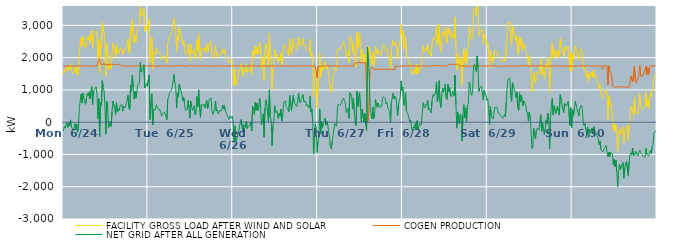
| Category | FACILITY GROSS LOAD AFTER WIND AND SOLAR | COGEN PRODUCTION | NET GRID AFTER ALL GENERATION |
|---|---|---|---|
|  Mon  6/24 | 1475 | 1747 | -272 |
|  Mon  6/24 | 1629 | 1749 | -120 |
|  Mon  6/24 | 1550 | 1734 | -184 |
|  Mon  6/24 | 1669 | 1739 | -70 |
|  Mon  6/24 | 1733 | 1733 | 0 |
|  Mon  6/24 | 1592 | 1755 | -163 |
|  Mon  6/24 | 1703 | 1735 | -32 |
|  Mon  6/24 | 1635 | 1749 | -114 |
|  Mon  6/24 | 1818 | 1746 | 72 |
|  Mon  6/24 | 1602 | 1747 | -145 |
|  Mon  6/24 | 1612 | 1739 | -127 |
|  Mon  6/24 | 1506 | 1746 | -240 |
|  Mon  6/24 | 1543 | 1742 | -199 |
|  Mon  6/24 | 1698 | 1747 | -49 |
|  Mon  6/24 | 1531 | 1743 | -212 |
|  Mon  6/24 | 1699 | 1755 | -56 |
|  Mon  6/24 | 1431 | 1742 | -311 |
|  Mon  6/24 | 1638 | 1750 | -112 |
|  Mon  6/24 | 2173 | 1754 | 419 |
|  Mon  6/24 | 2420 | 1741 | 679 |
|  Mon  6/24 | 2614 | 1742 | 872 |
|  Mon  6/24 | 2346 | 1752 | 594 |
|  Mon  6/24 | 2647 | 1748 | 899 |
|  Mon  6/24 | 2487 | 1754 | 733 |
|  Mon  6/24 | 2389 | 1743 | 646 |
|  Mon  6/24 | 2296 | 1744 | 552 |
|  Mon  6/24 | 2471 | 1741 | 730 |
|  Mon  6/24 | 2628 | 1738 | 890 |
|  Mon  6/24 | 2549 | 1742 | 807 |
|  Mon  6/24 | 2677 | 1743 | 934 |
|  Mon  6/24 | 2452 | 1730 | 722 |
|  Mon  6/24 | 2474 | 1739 | 735 |
|  Mon  6/24 | 2854 | 1747 | 1107 |
|  Mon  6/24 | 2291 | 1742 | 549 |
|  Mon  6/24 | 2698 | 1741 | 957 |
|  Mon  6/24 | 2743 | 1745 | 998 |
|  Mon  6/24 | 2795 | 1743 | 1052 |
|  Mon  6/24 | 2835 | 1746 | 1089 |
|  Mon  6/24 | 2575 | 1742 | 833 |
|  Mon  6/24 | 1968 | 1859 | 109 |
|  Mon  6/24 | 2559 | 1836 | 723 |
|  Mon  6/24 | 1522 | 1966 | -444 |
|  Mon  6/24 | 2411 | 1791 | 620 |
|  Mon  6/24 | 2300 | 1780 | 520 |
|  Mon  6/24 | 3084 | 1794 | 1290 |
|  Mon  6/24 | 2879 | 1801 | 1078 |
|  Mon  6/24 | 2775 | 1803 | 972 |
|  Mon  6/24 | 2272 | 1793 | 479 |
|  Mon  6/24 | 1422 | 1792 | -370 |
|  Mon  6/24 | 2439 | 1795 | 644 |
|  Mon  6/24 | 2243 | 1787 | 456 |
|  Mon  6/24 | 1620 | 1794 | -174 |
|  Mon  6/24 | 1679 | 1790 | -111 |
|  Mon  6/24 | 1817 | 1785 | 32 |
|  Mon  6/24 | 1671 | 1796 | -125 |
|  Mon  6/24 | 2133 | 1800 | 333 |
|  Mon  6/24 | 2448 | 1796 | 652 |
|  Mon  6/24 | 2459 | 1792 | 667 |
|  Mon  6/24 | 2208 | 1783 | 425 |
|  Mon  6/24 | 2035 | 1794 | 241 |
|  Mon  6/24 | 2397 | 1793 | 604 |
|  Mon  6/24 | 2124 | 1796 | 328 |
|  Mon  6/24 | 2199 | 1794 | 405 |
|  Mon  6/24 | 2154 | 1796 | 358 |
|  Mon  6/24 | 2295 | 1790 | 505 |
|  Mon  6/24 | 2288 | 1770 | 518 |
|  Mon  6/24 | 2295 | 1739 | 556 |
|  Mon  6/24 | 2084 | 1741 | 343 |
|  Mon  6/24 | 2233 | 1738 | 495 |
|  Mon  6/24 | 2229 | 1747 | 482 |
|  Mon  6/24 | 2198 | 1742 | 456 |
|  Mon  6/24 | 2314 | 1736 | 578 |
|  Mon  6/24 | 2403 | 1728 | 675 |
|  Mon  6/24 | 2578 | 1741 | 837 |
|  Mon  6/24 | 2184 | 1740 | 444 |
|  Mon  6/24 | 2130 | 1745 | 385 |
|  Mon  6/24 | 2879 | 1734 | 1145 |
|  Mon  6/24 | 2688 | 1733 | 955 |
|  Mon  6/24 | 3191 | 1734 | 1457 |
|  Mon  6/24 | 2820 | 1736 | 1084 |
|  Mon  6/24 | 2456 | 1743 | 713 |
|  Mon  6/24 | 2694 | 1744 | 950 |
|  Mon  6/24 | 2485 | 1740 | 745 |
|  Mon  6/24 | 2674 | 1738 | 936 |
|  Mon  6/24 | 2897 | 1750 | 1147 |
|  Mon  6/24 | 2916 | 1741 | 1175 |
|  Mon  6/24 | 2957 | 1741 | 1216 |
|  Mon  6/24 | 3605 | 1754 | 1851 |
|  Mon  6/24 | 3290 | 1742 | 1548 |
|  Mon  6/24 | 3269 | 1740 | 1529 |
|  Mon  6/24 | 3362 | 1736 | 1626 |
|  Mon  6/24 | 3522 | 1743 | 1779 |
|  Mon  6/24 | 2804 | 1737 | 1067 |
|  Mon  6/24 | 2867 | 1737 | 1130 |
|  Mon  6/24 | 2952 | 1750 | 1202 |
|  Mon  6/24 | 2855 | 1741 | 1114 |
|  Tue  6/25 | 3059 | 1741 | 1318 |
|  Tue  6/25 | 3204 | 1741 | 1463 |
|  Tue  6/25 | 1836 | 1750 | 86 |
|  Tue  6/25 | 2358 | 1739 | 619 |
|  Tue  6/25 | 2622 | 1743 | 879 |
|  Tue  6/25 | 1652 | 1741 | -89 |
|  Tue  6/25 | 2157 | 1757 | 400 |
|  Tue  6/25 | 2148 | 1736 | 412 |
|  Tue  6/25 | 2110 | 1722 | 388 |
|  Tue  6/25 | 2292 | 1751 | 541 |
|  Tue  6/25 | 2300 | 1743 | 557 |
|  Tue  6/25 | 2149 | 1741 | 408 |
|  Tue  6/25 | 2136 | 1735 | 401 |
|  Tue  6/25 | 2135 | 1750 | 385 |
|  Tue  6/25 | 2042 | 1741 | 301 |
|  Tue  6/25 | 1928 | 1737 | 191 |
|  Tue  6/25 | 1994 | 1736 | 258 |
|  Tue  6/25 | 1971 | 1720 | 251 |
|  Tue  6/25 | 2053 | 1741 | 312 |
|  Tue  6/25 | 2006 | 1738 | 268 |
|  Tue  6/25 | 1991 | 1747 | 244 |
|  Tue  6/25 | 1832 | 1756 | 76 |
|  Tue  6/25 | 2462 | 1747 | 715 |
|  Tue  6/25 | 2507 | 1735 | 772 |
|  Tue  6/25 | 2661 | 1734 | 927 |
|  Tue  6/25 | 2638 | 1735 | 903 |
|  Tue  6/25 | 2721 | 1739 | 982 |
|  Tue  6/25 | 2835 | 1743 | 1092 |
|  Tue  6/25 | 3011 | 1727 | 1284 |
|  Tue  6/25 | 3214 | 1739 | 1475 |
|  Tue  6/25 | 2970 | 1743 | 1227 |
|  Tue  6/25 | 2864 | 1747 | 1117 |
|  Tue  6/25 | 2190 | 1756 | 434 |
|  Tue  6/25 | 2656 | 1745 | 911 |
|  Tue  6/25 | 2519 | 1742 | 777 |
|  Tue  6/25 | 2926 | 1751 | 1175 |
|  Tue  6/25 | 2828 | 1746 | 1082 |
|  Tue  6/25 | 2826 | 1721 | 1105 |
|  Tue  6/25 | 2608 | 1747 | 861 |
|  Tue  6/25 | 2403 | 1745 | 658 |
|  Tue  6/25 | 2518 | 1746 | 772 |
|  Tue  6/25 | 2303 | 1741 | 562 |
|  Tue  6/25 | 2111 | 1739 | 372 |
|  Tue  6/25 | 2123 | 1738 | 385 |
|  Tue  6/25 | 2126 | 1740 | 386 |
|  Tue  6/25 | 2420 | 1739 | 681 |
|  Tue  6/25 | 2193 | 1738 | 455 |
|  Tue  6/25 | 1868 | 1749 | 119 |
|  Tue  6/25 | 2418 | 1761 | 657 |
|  Tue  6/25 | 2225 | 1736 | 489 |
|  Tue  6/25 | 2111 | 1746 | 365 |
|  Tue  6/25 | 2162 | 1742 | 420 |
|  Tue  6/25 | 2263 | 1753 | 510 |
|  Tue  6/25 | 1971 | 1739 | 232 |
|  Tue  6/25 | 2008 | 1737 | 271 |
|  Tue  6/25 | 2537 | 1745 | 792 |
|  Tue  6/25 | 2216 | 1739 | 477 |
|  Tue  6/25 | 2737 | 1735 | 1002 |
|  Tue  6/25 | 2161 | 1745 | 416 |
|  Tue  6/25 | 1895 | 1747 | 148 |
|  Tue  6/25 | 2297 | 1749 | 548 |
|  Tue  6/25 | 2249 | 1747 | 502 |
|  Tue  6/25 | 2256 | 1743 | 513 |
|  Tue  6/25 | 2304 | 1743 | 561 |
|  Tue  6/25 | 2186 | 1743 | 443 |
|  Tue  6/25 | 2288 | 1750 | 538 |
|  Tue  6/25 | 2427 | 1742 | 685 |
|  Tue  6/25 | 2154 | 1738 | 416 |
|  Tue  6/25 | 2271 | 1743 | 528 |
|  Tue  6/25 | 2462 | 1742 | 720 |
|  Tue  6/25 | 2451 | 1721 | 730 |
|  Tue  6/25 | 2496 | 1747 | 749 |
|  Tue  6/25 | 2085 | 1742 | 343 |
|  Tue  6/25 | 1973 | 1734 | 239 |
|  Tue  6/25 | 1974 | 1751 | 223 |
|  Tue  6/25 | 2132 | 1745 | 387 |
|  Tue  6/25 | 2387 | 1735 | 652 |
|  Tue  6/25 | 2089 | 1742 | 347 |
|  Tue  6/25 | 2129 | 1744 | 385 |
|  Tue  6/25 | 2002 | 1739 | 263 |
|  Tue  6/25 | 2023 | 1744 | 279 |
|  Tue  6/25 | 2108 | 1738 | 370 |
|  Tue  6/25 | 2081 | 1742 | 339 |
|  Tue  6/25 | 2109 | 1732 | 377 |
|  Tue  6/25 | 2277 | 1748 | 529 |
|  Tue  6/25 | 2155 | 1747 | 408 |
|  Tue  6/25 | 2261 | 1741 | 520 |
|  Tue  6/25 | 2107 | 1739 | 368 |
|  Tue  6/25 | 2045 | 1751 | 294 |
|  Tue  6/25 | 1975 | 1748 | 227 |
|  Tue  6/25 | 1930 | 1739 | 191 |
|  Tue  6/25 | 1825 | 1735 | 90 |
|  Tue  6/25 | 1812 | 1745 | 67 |
|  Tue  6/25 | 1925 | 1731 | 194 |
|  Tue  6/25 | 1867 | 1742 | 125 |
|  Tue  6/25 | 1912 | 1731 | 181 |
|  Wed  6/26 | 1759 | 1748 | 11 |
|  Wed  6/26 | 1141 | 1762 | -621 |
|  Wed  6/26 | 1637 | 1751 | -114 |
|  Wed  6/26 | 1151 | 1744 | -593 |
|  Wed  6/26 | 1190 | 1739 | -549 |
|  Wed  6/26 | 1327 | 1738 | -411 |
|  Wed  6/26 | 1310 | 1746 | -436 |
|  Wed  6/26 | 1588 | 1760 | -172 |
|  Wed  6/26 | 1719 | 1742 | -23 |
|  Wed  6/26 | 1819 | 1736 | 83 |
|  Wed  6/26 | 1820 | 1753 | 67 |
|  Wed  6/26 | 1438 | 1732 | -294 |
|  Wed  6/26 | 1663 | 1740 | -77 |
|  Wed  6/26 | 1643 | 1757 | -114 |
|  Wed  6/26 | 1556 | 1738 | -182 |
|  Wed  6/26 | 1783 | 1759 | 24 |
|  Wed  6/26 | 1532 | 1732 | -200 |
|  Wed  6/26 | 1597 | 1738 | -141 |
|  Wed  6/26 | 1600 | 1746 | -146 |
|  Wed  6/26 | 1655 | 1734 | -79 |
|  Wed  6/26 | 1751 | 1742 | 9 |
|  Wed  6/26 | 1469 | 1743 | -274 |
|  Wed  6/26 | 2226 | 1741 | 485 |
|  Wed  6/26 | 2192 | 1751 | 441 |
|  Wed  6/26 | 2011 | 1769 | 242 |
|  Wed  6/26 | 2351 | 1736 | 615 |
|  Wed  6/26 | 2118 | 1747 | 371 |
|  Wed  6/26 | 2324 | 1733 | 591 |
|  Wed  6/26 | 2107 | 1742 | 365 |
|  Wed  6/26 | 2202 | 1741 | 461 |
|  Wed  6/26 | 2482 | 1747 | 735 |
|  Wed  6/26 | 2205 | 1740 | 465 |
|  Wed  6/26 | 1668 | 1745 | -77 |
|  Wed  6/26 | 1775 | 1735 | 40 |
|  Wed  6/26 | 2000 | 1737 | 263 |
|  Wed  6/26 | 1296 | 1758 | -462 |
|  Wed  6/26 | 2192 | 1745 | 447 |
|  Wed  6/26 | 2431 | 1737 | 694 |
|  Wed  6/26 | 2294 | 1756 | 538 |
|  Wed  6/26 | 2305 | 1742 | 563 |
|  Wed  6/26 | 1741 | 1739 | 2 |
|  Wed  6/26 | 2740 | 1737 | 1003 |
|  Wed  6/26 | 1880 | 1743 | 137 |
|  Wed  6/26 | 1836 | 1740 | 96 |
|  Wed  6/26 | 1018 | 1741 | -723 |
|  Wed  6/26 | 1648 | 1752 | -104 |
|  Wed  6/26 | 1775 | 1753 | 22 |
|  Wed  6/26 | 2250 | 1739 | 511 |
|  Wed  6/26 | 2033 | 1733 | 300 |
|  Wed  6/26 | 2052 | 1739 | 313 |
|  Wed  6/26 | 2089 | 1747 | 342 |
|  Wed  6/26 | 1862 | 1750 | 112 |
|  Wed  6/26 | 2008 | 1743 | 265 |
|  Wed  6/26 | 1920 | 1737 | 183 |
|  Wed  6/26 | 2144 | 1737 | 407 |
|  Wed  6/26 | 1776 | 1741 | 35 |
|  Wed  6/26 | 1914 | 1736 | 178 |
|  Wed  6/26 | 2336 | 1750 | 586 |
|  Wed  6/26 | 2332 | 1745 | 587 |
|  Wed  6/26 | 2396 | 1733 | 663 |
|  Wed  6/26 | 2233 | 1754 | 479 |
|  Wed  6/26 | 2214 | 1749 | 465 |
|  Wed  6/26 | 2133 | 1738 | 395 |
|  Wed  6/26 | 2065 | 1740 | 325 |
|  Wed  6/26 | 2581 | 1752 | 829 |
|  Wed  6/26 | 2295 | 1744 | 551 |
|  Wed  6/26 | 2106 | 1740 | 366 |
|  Wed  6/26 | 2365 | 1734 | 631 |
|  Wed  6/26 | 2593 | 1753 | 840 |
|  Wed  6/26 | 2351 | 1751 | 600 |
|  Wed  6/26 | 2306 | 1738 | 568 |
|  Wed  6/26 | 2293 | 1731 | 562 |
|  Wed  6/26 | 2235 | 1753 | 482 |
|  Wed  6/26 | 2432 | 1750 | 682 |
|  Wed  6/26 | 2647 | 1744 | 903 |
|  Wed  6/26 | 2386 | 1748 | 638 |
|  Wed  6/26 | 2345 | 1746 | 599 |
|  Wed  6/26 | 2434 | 1736 | 698 |
|  Wed  6/26 | 2431 | 1740 | 691 |
|  Wed  6/26 | 2591 | 1741 | 850 |
|  Wed  6/26 | 2372 | 1737 | 635 |
|  Wed  6/26 | 2397 | 1742 | 655 |
|  Wed  6/26 | 2393 | 1743 | 650 |
|  Wed  6/26 | 2251 | 1748 | 503 |
|  Wed  6/26 | 2280 | 1738 | 542 |
|  Wed  6/26 | 2215 | 1748 | 467 |
|  Wed  6/26 | 2173 | 1739 | 434 |
|  Wed  6/26 | 2556 | 1748 | 808 |
|  Wed  6/26 | 2060 | 1734 | 326 |
|  Wed  6/26 | 2146 | 1736 | 410 |
|  Wed  6/26 | 1785 | 1751 | 34 |
|  Wed  6/26 | 752 | 1744 | -992 |
|  Wed  6/26 | 1257 | 1743 | -486 |
|  Wed  6/26 | 1691 | 1738 | -47 |
|  Wed  6/26 | 1483 | 1735 | -252 |
|  Wed  6/26 | 436 | 1376 | -940 |
|  Thu  6/27 | 1141 | 1741 | -600 |
|  Thu  6/27 | 1311 | 1759 | -448 |
|  Thu  6/27 | 2128 | 1728 | 400 |
|  Thu  6/27 | 1380 | 1743 | -363 |
|  Thu  6/27 | 1747 | 1733 | 14 |
|  Thu  6/27 | 1581 | 1743 | -162 |
|  Thu  6/27 | 1706 | 1747 | -41 |
|  Thu  6/27 | 1796 | 1749 | 47 |
|  Thu  6/27 | 1876 | 1746 | 130 |
|  Thu  6/27 | 1658 | 1738 | -80 |
|  Thu  6/27 | 1769 | 1747 | 22 |
|  Thu  6/27 | 1659 | 1749 | -90 |
|  Thu  6/27 | 1658 | 1745 | -87 |
|  Thu  6/27 | 1267 | 1729 | -462 |
|  Thu  6/27 | 994 | 1747 | -753 |
|  Thu  6/27 | 918 | 1739 | -821 |
|  Thu  6/27 | 1133 | 1735 | -602 |
|  Thu  6/27 | 1344 | 1734 | -390 |
|  Thu  6/27 | 1533 | 1753 | -220 |
|  Thu  6/27 | 1698 | 1739 | -41 |
|  Thu  6/27 | 1702 | 1737 | -35 |
|  Thu  6/27 | 1608 | 1733 | -125 |
|  Thu  6/27 | 2207 | 1738 | 469 |
|  Thu  6/27 | 2293 | 1742 | 551 |
|  Thu  6/27 | 2240 | 1731 | 509 |
|  Thu  6/27 | 2212 | 1733 | 479 |
|  Thu  6/27 | 2310 | 1749 | 561 |
|  Thu  6/27 | 2315 | 1740 | 575 |
|  Thu  6/27 | 2454 | 1747 | 707 |
|  Thu  6/27 | 2487 | 1742 | 745 |
|  Thu  6/27 | 2384 | 1736 | 648 |
|  Thu  6/27 | 2290 | 1738 | 552 |
|  Thu  6/27 | 2034 | 1738 | 296 |
|  Thu  6/27 | 2126 | 1737 | 389 |
|  Thu  6/27 | 2190 | 1753 | 437 |
|  Thu  6/27 | 1851 | 1731 | 120 |
|  Thu  6/27 | 2661 | 1747 | 914 |
|  Thu  6/27 | 2627 | 1732 | 895 |
|  Thu  6/27 | 2587 | 1745 | 842 |
|  Thu  6/27 | 2159 | 1742 | 417 |
|  Thu  6/27 | 2483 | 1734 | 749 |
|  Thu  6/27 | 2093 | 1736 | 357 |
|  Thu  6/27 | 1878 | 1847 | 31 |
|  Thu  6/27 | 1721 | 1825 | -104 |
|  Thu  6/27 | 2795 | 1834 | 961 |
|  Thu  6/27 | 2312 | 1830 | 482 |
|  Thu  6/27 | 2618 | 1852 | 766 |
|  Thu  6/27 | 2759 | 1844 | 915 |
|  Thu  6/27 | 2310 | 1841 | 469 |
|  Thu  6/27 | 1855 | 1841 | 14 |
|  Thu  6/27 | 2257 | 1847 | 410 |
|  Thu  6/27 | 2234 | 1844 | 390 |
|  Thu  6/27 | 1849 | 1842 | 7 |
|  Thu  6/27 | 2102 | 1837 | 265 |
|  Thu  6/27 | 1769 | 1850 | -81 |
|  Thu  6/27 | 1590 | 1846 | -256 |
|  Thu  6/27 | 2317 | 0 | 2317 |
|  Thu  6/27 | 1982 | 104 | 1878 |
|  Thu  6/27 | 2359 | 965 | 1394 |
|  Thu  6/27 | 2084 | 1638 | 446 |
|  Thu  6/27 | 1953 | 1691 | 262 |
|  Thu  6/27 | 1793 | 1688 | 105 |
|  Thu  6/27 | 2157 | 1690 | 467 |
|  Thu  6/27 | 1749 | 1636 | 113 |
|  Thu  6/27 | 1839 | 1642 | 197 |
|  Thu  6/27 | 2341 | 1640 | 701 |
|  Thu  6/27 | 2221 | 1643 | 578 |
|  Thu  6/27 | 2099 | 1642 | 457 |
|  Thu  6/27 | 2234 | 1640 | 594 |
|  Thu  6/27 | 2143 | 1637 | 506 |
|  Thu  6/27 | 2110 | 1650 | 460 |
|  Thu  6/27 | 2065 | 1631 | 434 |
|  Thu  6/27 | 2144 | 1651 | 493 |
|  Thu  6/27 | 2364 | 1639 | 725 |
|  Thu  6/27 | 2424 | 1634 | 790 |
|  Thu  6/27 | 2444 | 1637 | 807 |
|  Thu  6/27 | 2359 | 1628 | 731 |
|  Thu  6/27 | 2209 | 1645 | 564 |
|  Thu  6/27 | 2254 | 1641 | 613 |
|  Thu  6/27 | 2081 | 1636 | 445 |
|  Thu  6/27 | 2066 | 1642 | 424 |
|  Thu  6/27 | 1963 | 1635 | 328 |
|  Thu  6/27 | 1599 | 1625 | -26 |
|  Thu  6/27 | 2249 | 1635 | 614 |
|  Thu  6/27 | 2400 | 1641 | 759 |
|  Thu  6/27 | 2540 | 1639 | 901 |
|  Thu  6/27 | 2364 | 1638 | 726 |
|  Thu  6/27 | 2435 | 1630 | 805 |
|  Thu  6/27 | 2494 | 1737 | 757 |
|  Thu  6/27 | 2323 | 1743 | 580 |
|  Thu  6/27 | 1938 | 1741 | 197 |
|  Thu  6/27 | 2254 | 1743 | 511 |
|  Thu  6/27 | 2401 | 1725 | 676 |
|  Thu  6/27 | 2505 | 1741 | 764 |
|  Thu  6/27 | 3023 | 1743 | 1280 |
|  Thu  6/27 | 2721 | 1743 | 978 |
|  Fri  6/28 | 2833 | 1742 | 1091 |
|  Fri  6/28 | 2271 | 1744 | 527 |
|  Fri  6/28 | 2362 | 1733 | 629 |
|  Fri  6/28 | 2681 | 1745 | 936 |
|  Fri  6/28 | 2094 | 1757 | 337 |
|  Fri  6/28 | 2046 | 1743 | 303 |
|  Fri  6/28 | 1963 | 1738 | 225 |
|  Fri  6/28 | 1971 | 1746 | 225 |
|  Fri  6/28 | 1760 | 1746 | 14 |
|  Fri  6/28 | 1805 | 1740 | 65 |
|  Fri  6/28 | 1517 | 1748 | -231 |
|  Fri  6/28 | 1465 | 1735 | -270 |
|  Fri  6/28 | 1609 | 1751 | -142 |
|  Fri  6/28 | 1545 | 1732 | -187 |
|  Fri  6/28 | 1697 | 1737 | -40 |
|  Fri  6/28 | 1499 | 1733 | -234 |
|  Fri  6/28 | 1786 | 1740 | 46 |
|  Fri  6/28 | 1508 | 1742 | -234 |
|  Fri  6/28 | 1594 | 1737 | -143 |
|  Fri  6/28 | 1706 | 1740 | -34 |
|  Fri  6/28 | 1636 | 1737 | -101 |
|  Fri  6/28 | 1705 | 1755 | -50 |
|  Fri  6/28 | 2060 | 1754 | 306 |
|  Fri  6/28 | 2353 | 1750 | 603 |
|  Fri  6/28 | 2215 | 1740 | 475 |
|  Fri  6/28 | 2182 | 1740 | 442 |
|  Fri  6/28 | 2302 | 1740 | 562 |
|  Fri  6/28 | 2271 | 1742 | 529 |
|  Fri  6/28 | 2413 | 1729 | 684 |
|  Fri  6/28 | 2115 | 1740 | 375 |
|  Fri  6/28 | 2168 | 1737 | 431 |
|  Fri  6/28 | 2104 | 1736 | 368 |
|  Fri  6/28 | 2031 | 1744 | 287 |
|  Fri  6/28 | 2402 | 1744 | 658 |
|  Fri  6/28 | 2597 | 1746 | 851 |
|  Fri  6/28 | 2550 | 1757 | 793 |
|  Fri  6/28 | 2615 | 1748 | 867 |
|  Fri  6/28 | 2683 | 1746 | 937 |
|  Fri  6/28 | 3003 | 1754 | 1249 |
|  Fri  6/28 | 2379 | 1743 | 636 |
|  Fri  6/28 | 2541 | 1753 | 788 |
|  Fri  6/28 | 3031 | 1745 | 1286 |
|  Fri  6/28 | 2362 | 1745 | 617 |
|  Fri  6/28 | 2189 | 1733 | 456 |
|  Fri  6/28 | 2599 | 1746 | 853 |
|  Fri  6/28 | 2802 | 1747 | 1055 |
|  Fri  6/28 | 2669 | 1738 | 931 |
|  Fri  6/28 | 2742 | 1738 | 1004 |
|  Fri  6/28 | 2920 | 1745 | 1175 |
|  Fri  6/28 | 2512 | 1746 | 766 |
|  Fri  6/28 | 2446 | 1742 | 704 |
|  Fri  6/28 | 2932 | 1753 | 1179 |
|  Fri  6/28 | 2745 | 1795 | 950 |
|  Fri  6/28 | 2873 | 1803 | 1070 |
|  Fri  6/28 | 2620 | 1796 | 824 |
|  Fri  6/28 | 2580 | 1794 | 786 |
|  Fri  6/28 | 2746 | 1793 | 953 |
|  Fri  6/28 | 2701 | 1797 | 904 |
|  Fri  6/28 | 2606 | 1789 | 817 |
|  Fri  6/28 | 3255 | 1798 | 1457 |
|  Fri  6/28 | 2351 | 1787 | 564 |
|  Fri  6/28 | 1604 | 1790 | -186 |
|  Fri  6/28 | 2115 | 1807 | 308 |
|  Fri  6/28 | 1826 | 1780 | 46 |
|  Fri  6/28 | 1697 | 1748 | -51 |
|  Fri  6/28 | 2006 | 1754 | 252 |
|  Fri  6/28 | 1862 | 1740 | 122 |
|  Fri  6/28 | 1151 | 1736 | -585 |
|  Fri  6/28 | 1974 | 1739 | 235 |
|  Fri  6/28 | 2283 | 1742 | 541 |
|  Fri  6/28 | 1881 | 1741 | 140 |
|  Fri  6/28 | 2178 | 1750 | 428 |
|  Fri  6/28 | 1752 | 1743 | 9 |
|  Fri  6/28 | 2262 | 1739 | 523 |
|  Fri  6/28 | 2294 | 1734 | 560 |
|  Fri  6/28 | 2974 | 1742 | 1232 |
|  Fri  6/28 | 2914 | 1738 | 1176 |
|  Fri  6/28 | 2613 | 1738 | 875 |
|  Fri  6/28 | 2565 | 1736 | 829 |
|  Fri  6/28 | 2736 | 1730 | 1006 |
|  Fri  6/28 | 3492 | 1745 | 1747 |
|  Fri  6/28 | 3530 | 1745 | 1785 |
|  Fri  6/28 | 3456 | 1744 | 1712 |
|  Fri  6/28 | 3308 | 1738 | 1570 |
|  Fri  6/28 | 3791 | 1750 | 2041 |
|  Fri  6/28 | 3434 | 1739 | 1695 |
|  Fri  6/28 | 2690 | 1734 | 956 |
|  Fri  6/28 | 2796 | 1731 | 1065 |
|  Fri  6/28 | 2831 | 1744 | 1087 |
|  Fri  6/28 | 2852 | 1739 | 1113 |
|  Fri  6/28 | 2874 | 1744 | 1130 |
|  Fri  6/28 | 2441 | 1756 | 685 |
|  Fri  6/28 | 2734 | 1742 | 992 |
|  Fri  6/28 | 2631 | 1752 | 879 |
|  Fri  6/28 | 2571 | 1730 | 841 |
|  Fri  6/28 | 2408 | 1731 | 677 |
|  Sat  6/29 | 2473 | 1749 | 724 |
|  Sat  6/29 | 2164 | 1741 | 423 |
|  Sat  6/29 | 1668 | 1744 | -76 |
|  Sat  6/29 | 2231 | 1744 | 487 |
|  Sat  6/29 | 1935 | 1734 | 201 |
|  Sat  6/29 | 1966 | 1747 | 219 |
|  Sat  6/29 | 1844 | 1747 | 97 |
|  Sat  6/29 | 1853 | 1733 | 120 |
|  Sat  6/29 | 2212 | 1754 | 458 |
|  Sat  6/29 | 2231 | 1743 | 488 |
|  Sat  6/29 | 2206 | 1743 | 463 |
|  Sat  6/29 | 2145 | 1745 | 400 |
|  Sat  6/29 | 2017 | 1734 | 283 |
|  Sat  6/29 | 2039 | 1753 | 286 |
|  Sat  6/29 | 1972 | 1736 | 236 |
|  Sat  6/29 | 1938 | 1737 | 201 |
|  Sat  6/29 | 1877 | 1734 | 143 |
|  Sat  6/29 | 1858 | 1748 | 110 |
|  Sat  6/29 | 1884 | 1731 | 153 |
|  Sat  6/29 | 1979 | 1740 | 239 |
|  Sat  6/29 | 1907 | 1735 | 172 |
|  Sat  6/29 | 2373 | 1742 | 631 |
|  Sat  6/29 | 2822 | 1739 | 1083 |
|  Sat  6/29 | 3085 | 1750 | 1335 |
|  Sat  6/29 | 3082 | 1737 | 1345 |
|  Sat  6/29 | 3114 | 1746 | 1368 |
|  Sat  6/29 | 2564 | 1742 | 822 |
|  Sat  6/29 | 2380 | 1738 | 642 |
|  Sat  6/29 | 2965 | 1748 | 1217 |
|  Sat  6/29 | 2895 | 1757 | 1138 |
|  Sat  6/29 | 2898 | 1740 | 1158 |
|  Sat  6/29 | 2662 | 1747 | 915 |
|  Sat  6/29 | 2514 | 1746 | 768 |
|  Sat  6/29 | 2679 | 1740 | 939 |
|  Sat  6/29 | 2173 | 1733 | 440 |
|  Sat  6/29 | 2095 | 1730 | 365 |
|  Sat  6/29 | 2644 | 1735 | 909 |
|  Sat  6/29 | 2374 | 1741 | 633 |
|  Sat  6/29 | 2595 | 1757 | 838 |
|  Sat  6/29 | 2367 | 1738 | 629 |
|  Sat  6/29 | 2243 | 1734 | 509 |
|  Sat  6/29 | 2414 | 1753 | 661 |
|  Sat  6/29 | 2335 | 1750 | 585 |
|  Sat  6/29 | 2252 | 1747 | 505 |
|  Sat  6/29 | 2094 | 1752 | 342 |
|  Sat  6/29 | 1996 | 1732 | 264 |
|  Sat  6/29 | 1772 | 1741 | 31 |
|  Sat  6/29 | 2056 | 1740 | 316 |
|  Sat  6/29 | 1906 | 1733 | 173 |
|  Sat  6/29 | 1539 | 1748 | -209 |
|  Sat  6/29 | 937 | 1752 | -815 |
|  Sat  6/29 | 984 | 1736 | -752 |
|  Sat  6/29 | 1557 | 1750 | -193 |
|  Sat  6/29 | 1558 | 1755 | -197 |
|  Sat  6/29 | 1223 | 1740 | -517 |
|  Sat  6/29 | 1477 | 1737 | -260 |
|  Sat  6/29 | 1553 | 1736 | -183 |
|  Sat  6/29 | 1545 | 1750 | -205 |
|  Sat  6/29 | 1497 | 1746 | -249 |
|  Sat  6/29 | 1768 | 1734 | 34 |
|  Sat  6/29 | 1984 | 1755 | 229 |
|  Sat  6/29 | 1468 | 1755 | -287 |
|  Sat  6/29 | 1725 | 1741 | -16 |
|  Sat  6/29 | 1537 | 1729 | -192 |
|  Sat  6/29 | 1337 | 1736 | -399 |
|  Sat  6/29 | 1537 | 1734 | -197 |
|  Sat  6/29 | 1806 | 1735 | 71 |
|  Sat  6/29 | 1682 | 1738 | -56 |
|  Sat  6/29 | 2020 | 1746 | 274 |
|  Sat  6/29 | 1848 | 1754 | 94 |
|  Sat  6/29 | 915 | 1746 | -831 |
|  Sat  6/29 | 1856 | 1740 | 116 |
|  Sat  6/29 | 2247 | 1734 | 513 |
|  Sat  6/29 | 2480 | 1744 | 736 |
|  Sat  6/29 | 1974 | 1747 | 227 |
|  Sat  6/29 | 2256 | 1747 | 509 |
|  Sat  6/29 | 2273 | 1737 | 536 |
|  Sat  6/29 | 2017 | 1742 | 275 |
|  Sat  6/29 | 2002 | 1753 | 249 |
|  Sat  6/29 | 2226 | 1740 | 486 |
|  Sat  6/29 | 2080 | 1738 | 342 |
|  Sat  6/29 | 1979 | 1760 | 219 |
|  Sat  6/29 | 2599 | 1750 | 849 |
|  Sat  6/29 | 2455 | 1750 | 705 |
|  Sat  6/29 | 2456 | 1738 | 718 |
|  Sat  6/29 | 2160 | 1749 | 411 |
|  Sat  6/29 | 2030 | 1731 | 299 |
|  Sat  6/29 | 2331 | 1749 | 582 |
|  Sat  6/29 | 2350 | 1738 | 612 |
|  Sat  6/29 | 2231 | 1737 | 494 |
|  Sat  6/29 | 2206 | 1730 | 476 |
|  Sat  6/29 | 2364 | 1726 | 638 |
|  Sat  6/29 | 2392 | 1727 | 665 |
|  Sat  6/29 | 1632 | 1737 | -105 |
|  Sat  6/29 | 2193 | 1747 | 446 |
|  Sat  6/29 | 1574 | 1741 | -167 |
|  Sun  6/30 | 2110 | 1730 | 380 |
|  Sun  6/30 | 1945 | 1735 | 210 |
|  Sun  6/30 | 2154 | 1744 | 410 |
|  Sun  6/30 | 2380 | 1737 | 643 |
|  Sun  6/30 | 2260 | 1730 | 530 |
|  Sun  6/30 | 2163 | 1738 | 425 |
|  Sun  6/30 | 2193 | 1743 | 450 |
|  Sun  6/30 | 1924 | 1738 | 186 |
|  Sun  6/30 | 2153 | 1740 | 413 |
|  Sun  6/30 | 2176 | 1736 | 440 |
|  Sun  6/30 | 2274 | 1748 | 526 |
|  Sun  6/30 | 2160 | 1735 | 425 |
|  Sun  6/30 | 1727 | 1751 | -24 |
|  Sun  6/30 | 1619 | 1731 | -112 |
|  Sun  6/30 | 1690 | 1732 | -42 |
|  Sun  6/30 | 1519 | 1742 | -223 |
|  Sun  6/30 | 1380 | 1755 | -375 |
|  Sun  6/30 | 1589 | 1739 | -150 |
|  Sun  6/30 | 1254 | 1743 | -489 |
|  Sun  6/30 | 1518 | 1747 | -229 |
|  Sun  6/30 | 1416 | 1743 | -327 |
|  Sun  6/30 | 1454 | 1748 | -294 |
|  Sun  6/30 | 1556 | 1738 | -182 |
|  Sun  6/30 | 1395 | 1755 | -360 |
|  Sun  6/30 | 1600 | 1741 | -141 |
|  Sun  6/30 | 1384 | 1743 | -359 |
|  Sun  6/30 | 1377 | 1735 | -358 |
|  Sun  6/30 | 1409 | 1734 | -325 |
|  Sun  6/30 | 1276 | 1750 | -474 |
|  Sun  6/30 | 1227 | 1738 | -511 |
|  Sun  6/30 | 1038 | 1737 | -699 |
|  Sun  6/30 | 1160 | 1744 | -584 |
|  Sun  6/30 | 897 | 1736 | -839 |
|  Sun  6/30 | 916 | 1734 | -818 |
|  Sun  6/30 | 725 | 1643 | -918 |
|  Sun  6/30 | 829 | 1757 | -928 |
|  Sun  6/30 | 904 | 1727 | -823 |
|  Sun  6/30 | 926 | 1745 | -819 |
|  Sun  6/30 | 1022 | 1741 | -719 |
|  Sun  6/30 | 827 | 1742 | -915 |
|  Sun  6/30 | 86 | 1151 | -1065 |
|  Sun  6/30 | 820 | 1743 | -923 |
|  Sun  6/30 | 525 | 1594 | -1069 |
|  Sun  6/30 | 619 | 1559 | -940 |
|  Sun  6/30 | 518 | 1486 | -968 |
|  Sun  6/30 | 179 | 1157 | -978 |
|  Sun  6/30 | -223 | 1090 | -1313 |
|  Sun  6/30 | -33 | 1108 | -1141 |
|  Sun  6/30 | -296 | 1090 | -1386 |
|  Sun  6/30 | -83 | 1090 | -1173 |
|  Sun  6/30 | -453 | 1097 | -1550 |
|  Sun  6/30 | -903 | 1092 | -1995 |
|  Sun  6/30 | -467 | 1087 | -1554 |
|  Sun  6/30 | -211 | 1087 | -1298 |
|  Sun  6/30 | -373 | 1092 | -1465 |
|  Sun  6/30 | -272 | 1102 | -1374 |
|  Sun  6/30 | -268 | 1098 | -1366 |
|  Sun  6/30 | -149 | 1100 | -1249 |
|  Sun  6/30 | -636 | 1100 | -1736 |
|  Sun  6/30 | -346 | 1091 | -1437 |
|  Sun  6/30 | -204 | 1082 | -1286 |
|  Sun  6/30 | -140 | 1080 | -1220 |
|  Sun  6/30 | -109 | 1087 | -1196 |
|  Sun  6/30 | -557 | 1096 | -1653 |
|  Sun  6/30 | -131 | 1083 | -1214 |
|  Sun  6/30 | 95 | 1101 | -1006 |
|  Sun  6/30 | 481 | 1429 | -948 |
|  Sun  6/30 | 400 | 1419 | -1019 |
|  Sun  6/30 | 438 | 1250 | -812 |
|  Sun  6/30 | 186 | 1222 | -1036 |
|  Sun  6/30 | 772 | 1726 | -954 |
|  Sun  6/30 | 288 | 1289 | -1001 |
|  Sun  6/30 | 317 | 1220 | -903 |
|  Sun  6/30 | 309 | 1296 | -987 |
|  Sun  6/30 | 247 | 1297 | -1050 |
|  Sun  6/30 | 492 | 1442 | -950 |
|  Sun  6/30 | 884 | 1747 | -863 |
|  Sun  6/30 | 493 | 1441 | -948 |
|  Sun  6/30 | 486 | 1466 | -980 |
|  Sun  6/30 | 402 | 1418 | -1016 |
|  Sun  6/30 | 425 | 1490 | -1065 |
|  Sun  6/30 | 459 | 1524 | -1065 |
|  Sun  6/30 | 543 | 1632 | -1089 |
|  Sun  6/30 | 931 | 1741 | -810 |
|  Sun  6/30 | 485 | 1471 | -986 |
|  Sun  6/30 | 701 | 1687 | -986 |
|  Sun  6/30 | 417 | 1465 | -1048 |
|  Sun  6/30 | 721 | 1663 | -942 |
|  Sun  6/30 | 868 | 1736 | -868 |
|  Sun  6/30 | 777 | 1751 | -974 |
|  Sun  6/30 | 984 | 1748 | -764 |
|  Sun  6/30 | 1027 | 1736 | -709 |
|  Sun  6/30 | 1396 | 1742 | -346 |
|  Sun  6/30 | 1390 | 1742 | -352 |
|  Sun  6/30 | 1469 | 1748 | -279 |
|  Sun  6/30 | 1501 | 1743 | -242 |